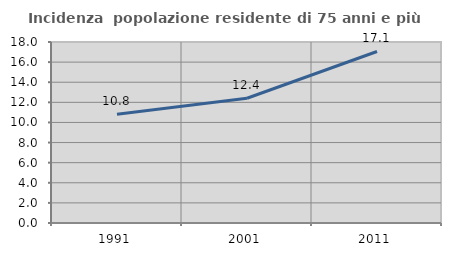
| Category | Incidenza  popolazione residente di 75 anni e più |
|---|---|
| 1991.0 | 10.818 |
| 2001.0 | 12.41 |
| 2011.0 | 17.057 |